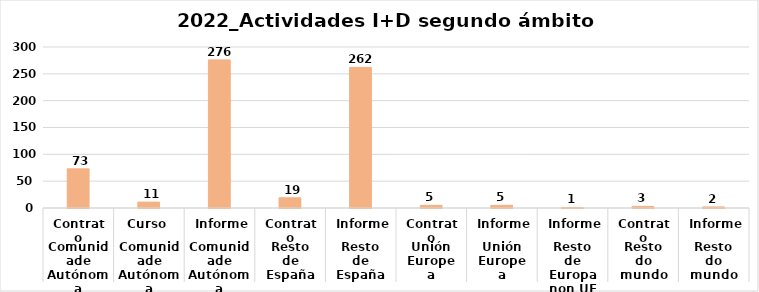
| Category | Series 0 |
|---|---|
| 0 | 73 |
| 1 | 11 |
| 2 | 276 |
| 3 | 19 |
| 4 | 262 |
| 5 | 5 |
| 6 | 5 |
| 7 | 1 |
| 8 | 3 |
| 9 | 2 |